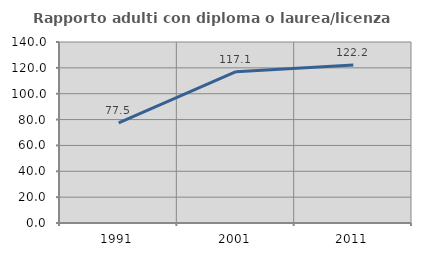
| Category | Rapporto adulti con diploma o laurea/licenza media  |
|---|---|
| 1991.0 | 77.5 |
| 2001.0 | 117.073 |
| 2011.0 | 122.222 |